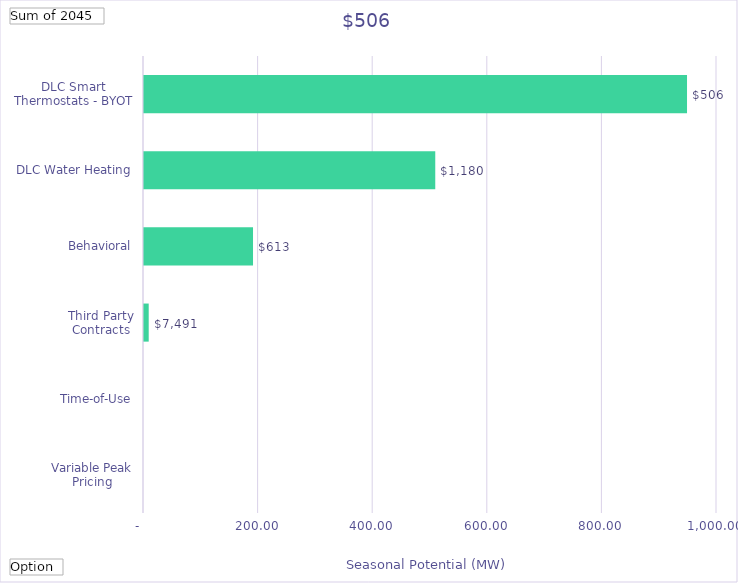
| Category | Winter Peak Reduction @Meter  (Therms) |
|---|---|
| Variable Peak Pricing | 0 |
| Time-of-Use | 0 |
| Third Party Contracts | 8.208 |
| Behavioral | 190.254 |
| DLC Water Heating | 508.306 |
| DLC Smart Thermostats - BYOT | 947.673 |